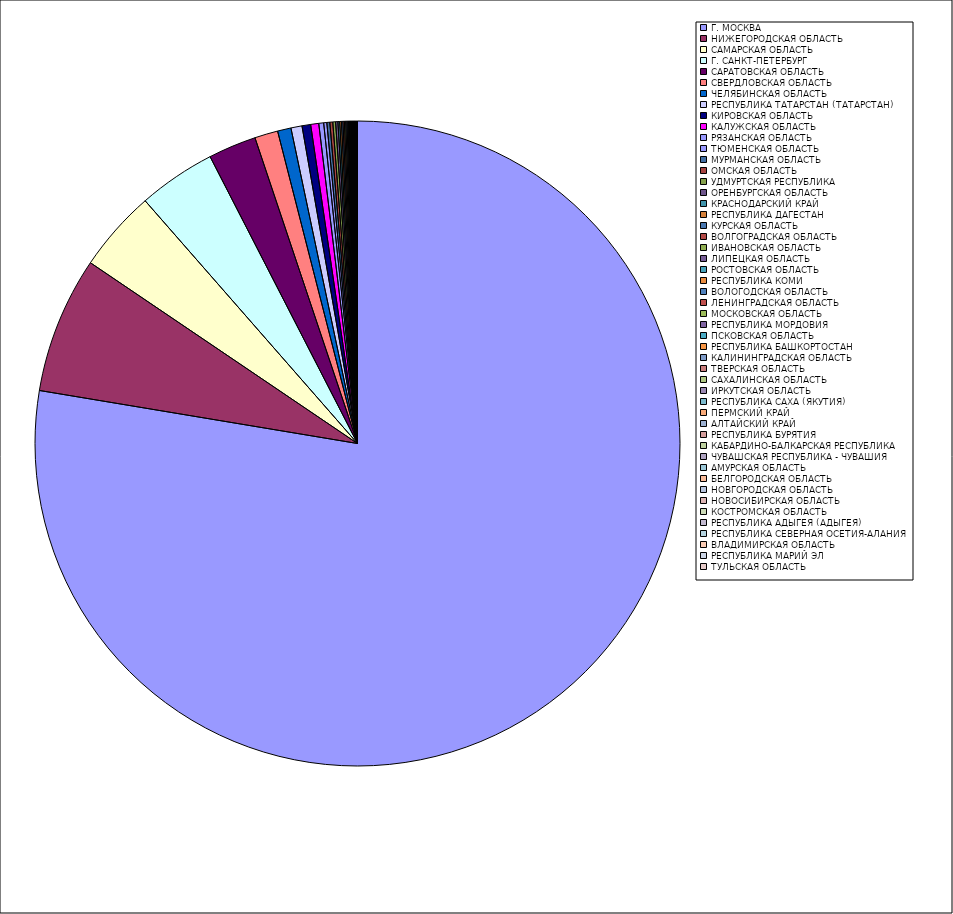
| Category | Оборот |
|---|---|
| Г. МОСКВА | 77.615 |
| НИЖЕГОРОДСКАЯ ОБЛАСТЬ | 6.839 |
| САМАРСКАЯ ОБЛАСТЬ | 4.092 |
| Г. САНКТ-ПЕТЕРБУРГ | 3.883 |
| САРАТОВСКАЯ ОБЛАСТЬ | 2.405 |
| СВЕРДЛОВСКАЯ ОБЛАСТЬ | 1.164 |
| ЧЕЛЯБИНСКАЯ ОБЛАСТЬ | 0.676 |
| РЕСПУБЛИКА ТАТАРСТАН (ТАТАРСТАН) | 0.555 |
| КИРОВСКАЯ ОБЛАСТЬ | 0.434 |
| КАЛУЖСКАЯ ОБЛАСТЬ | 0.403 |
| РЯЗАНСКАЯ ОБЛАСТЬ | 0.244 |
| ТЮМЕНСКАЯ ОБЛАСТЬ | 0.157 |
| МУРМАНСКАЯ ОБЛАСТЬ | 0.149 |
| ОМСКАЯ ОБЛАСТЬ | 0.147 |
| УДМУРТСКАЯ РЕСПУБЛИКА | 0.139 |
| ОРЕНБУРГСКАЯ ОБЛАСТЬ | 0.114 |
| КРАСНОДАРСКИЙ КРАЙ | 0.089 |
| РЕСПУБЛИКА ДАГЕСТАН | 0.084 |
| КУРСКАЯ ОБЛАСТЬ | 0.074 |
| ВОЛГОГРАДСКАЯ ОБЛАСТЬ | 0.073 |
| ИВАНОВСКАЯ ОБЛАСТЬ | 0.065 |
| ЛИПЕЦКАЯ ОБЛАСТЬ | 0.06 |
| РОСТОВСКАЯ ОБЛАСТЬ | 0.048 |
| РЕСПУБЛИКА КОМИ | 0.036 |
| ВОЛОГОДСКАЯ ОБЛАСТЬ | 0.035 |
| ЛЕНИНГРАДСКАЯ ОБЛАСТЬ | 0.034 |
| МОСКОВСКАЯ ОБЛАСТЬ | 0.03 |
| РЕСПУБЛИКА МОРДОВИЯ | 0.029 |
| ПСКОВСКАЯ ОБЛАСТЬ | 0.027 |
| РЕСПУБЛИКА БАШКОРТОСТАН | 0.027 |
| КАЛИНИНГРАДСКАЯ ОБЛАСТЬ | 0.026 |
| ТВЕРСКАЯ ОБЛАСТЬ | 0.022 |
| САХАЛИНСКАЯ ОБЛАСТЬ | 0.02 |
| ИРКУТСКАЯ ОБЛАСТЬ | 0.019 |
| РЕСПУБЛИКА САХА (ЯКУТИЯ) | 0.019 |
| ПЕРМСКИЙ КРАЙ | 0.018 |
| АЛТАЙСКИЙ КРАЙ | 0.017 |
| РЕСПУБЛИКА БУРЯТИЯ | 0.013 |
| КАБАРДИНО-БАЛКАРСКАЯ РЕСПУБЛИКА | 0.013 |
| ЧУВАШСКАЯ РЕСПУБЛИКА - ЧУВАШИЯ | 0.012 |
| АМУРСКАЯ ОБЛАСТЬ | 0.01 |
| БЕЛГОРОДСКАЯ ОБЛАСТЬ | 0.01 |
| НОВГОРОДСКАЯ ОБЛАСТЬ | 0.01 |
| НОВОСИБИРСКАЯ ОБЛАСТЬ | 0.01 |
| КОСТРОМСКАЯ ОБЛАСТЬ | 0.008 |
| РЕСПУБЛИКА АДЫГЕЯ (АДЫГЕЯ) | 0.008 |
| РЕСПУБЛИКА СЕВЕРНАЯ ОСЕТИЯ-АЛАНИЯ | 0.006 |
| ВЛАДИМИРСКАЯ ОБЛАСТЬ | 0.006 |
| РЕСПУБЛИКА МАРИЙ ЭЛ | 0.005 |
| ТУЛЬСКАЯ ОБЛАСТЬ | 0.005 |